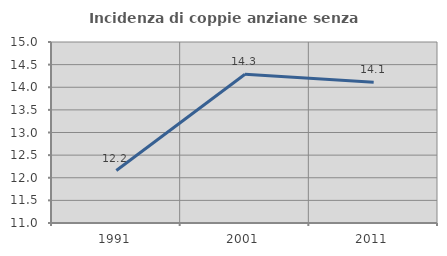
| Category | Incidenza di coppie anziane senza figli  |
|---|---|
| 1991.0 | 12.159 |
| 2001.0 | 14.286 |
| 2011.0 | 14.113 |